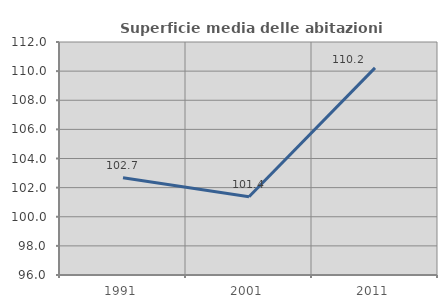
| Category | Superficie media delle abitazioni occupate |
|---|---|
| 1991.0 | 102.681 |
| 2001.0 | 101.37 |
| 2011.0 | 110.222 |